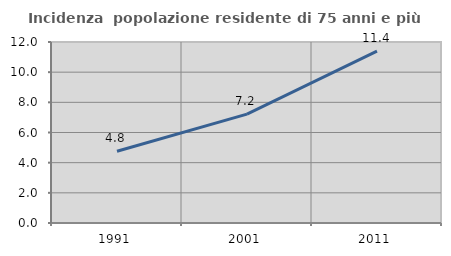
| Category | Incidenza  popolazione residente di 75 anni e più |
|---|---|
| 1991.0 | 4.759 |
| 2001.0 | 7.216 |
| 2011.0 | 11.389 |